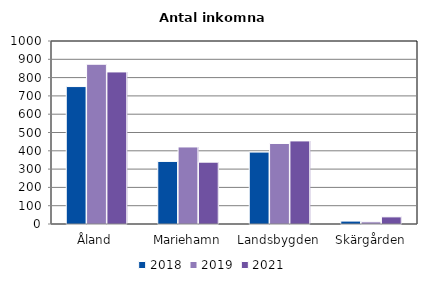
| Category | 2018 | 2019 | 2021 |
|---|---|---|---|
| Åland | 751 | 873 | 831 |
| Mariehamn | 342 | 421 | 338 |
| Landsbygden | 393 | 440 | 454 |
| Skärgården | 16 | 12 | 39 |